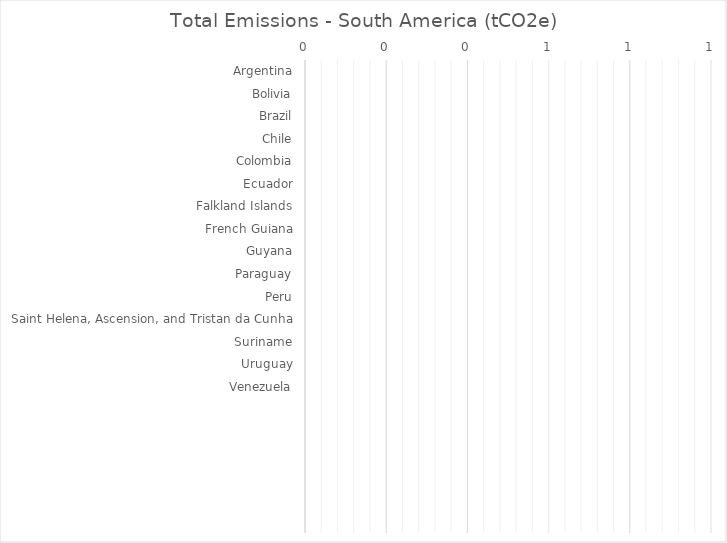
| Category | Total Emissions - South America (tCO2e) |
|---|---|
| Argentina | 0 |
| Bolivia | 0 |
| Brazil | 0 |
| Chile | 0 |
| Colombia | 0 |
| Ecuador | 0 |
| Falkland Islands | 0 |
| French Guiana | 0 |
| Guyana | 0 |
| Paraguay | 0 |
| Peru | 0 |
| Saint Helena, Ascension, and Tristan da Cunha | 0 |
| Suriname | 0 |
| Uruguay | 0 |
| Venezuela | 0 |